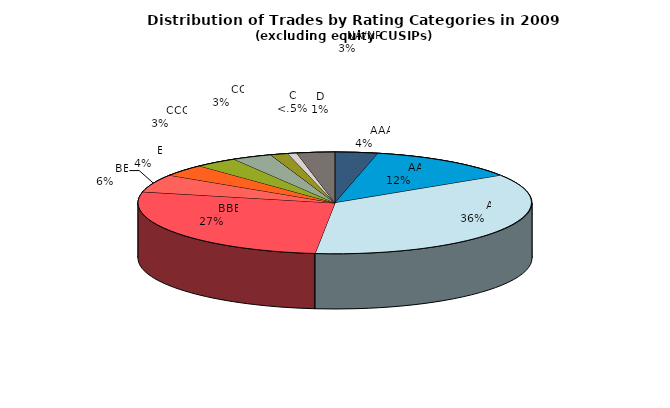
| Category | Series 0 |
|---|---|
|         AAA | 1517.421 |
|         AA | 5388.845 |
|         A | 15434.806 |
|         BBB | 11637.179 |
|         BB | 2448.865 |
|         B | 1641.095 |
|         CCC | 1510.754 |
|         CC | 1411.357 |
|         C | 620.694 |
|         D | 323.238 |
|         NA/NR | 1349.401 |